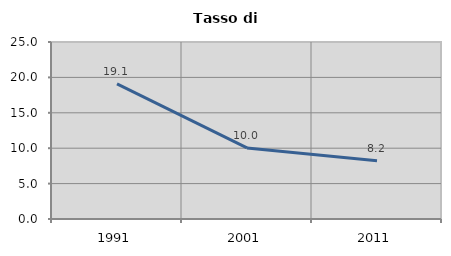
| Category | Tasso di disoccupazione   |
|---|---|
| 1991.0 | 19.079 |
| 2001.0 | 10.035 |
| 2011.0 | 8.24 |